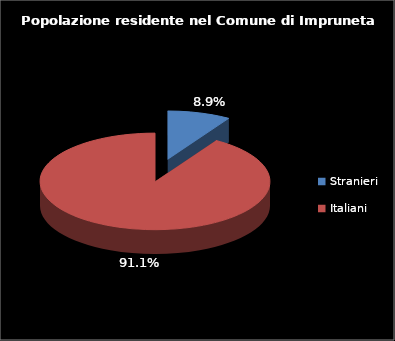
| Category | Series 0 |
|---|---|
| Stranieri | 1284 |
| Italiani | 13159 |